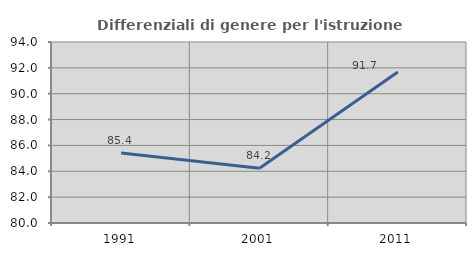
| Category | Differenziali di genere per l'istruzione superiore |
|---|---|
| 1991.0 | 85.417 |
| 2001.0 | 84.243 |
| 2011.0 | 91.672 |